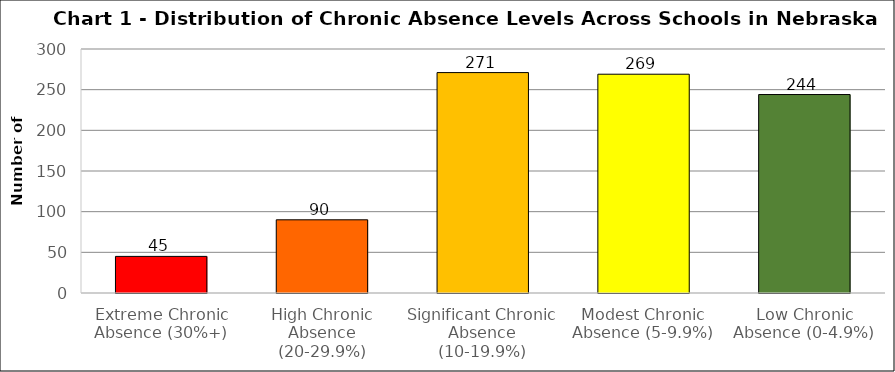
| Category | Series 0 |
|---|---|
| Extreme Chronic Absence (30%+) | 45 |
| High Chronic Absence (20-29.9%) | 90 |
| Significant Chronic Absence (10-19.9%) | 271 |
| Modest Chronic Absence (5-9.9%) | 269 |
| Low Chronic Absence (0-4.9%) | 244 |